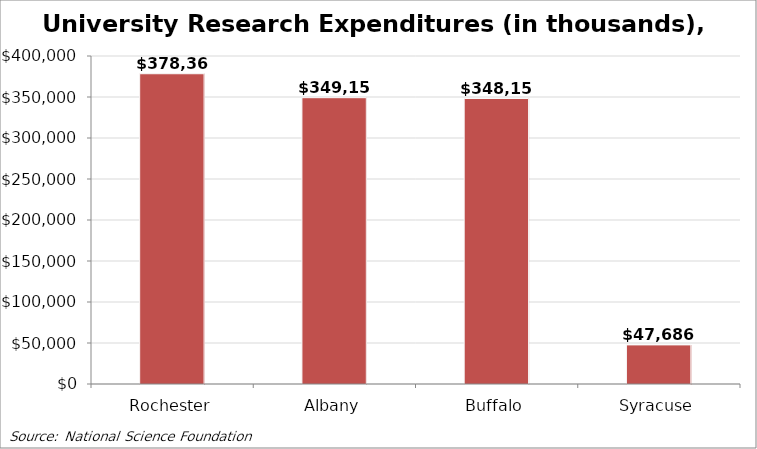
| Category | University research expenditures*, 2008 (thousands) |
|---|---|
| Rochester | 378368 |
| Albany | 349154 |
| Buffalo | 348155 |
| Syracuse | 47686 |